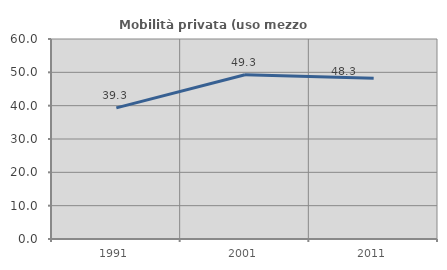
| Category | Mobilità privata (uso mezzo privato) |
|---|---|
| 1991.0 | 39.327 |
| 2001.0 | 49.264 |
| 2011.0 | 48.25 |